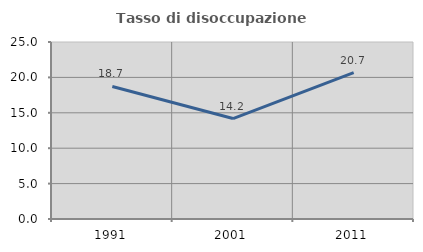
| Category | Tasso di disoccupazione giovanile  |
|---|---|
| 1991.0 | 18.72 |
| 2001.0 | 14.189 |
| 2011.0 | 20.677 |